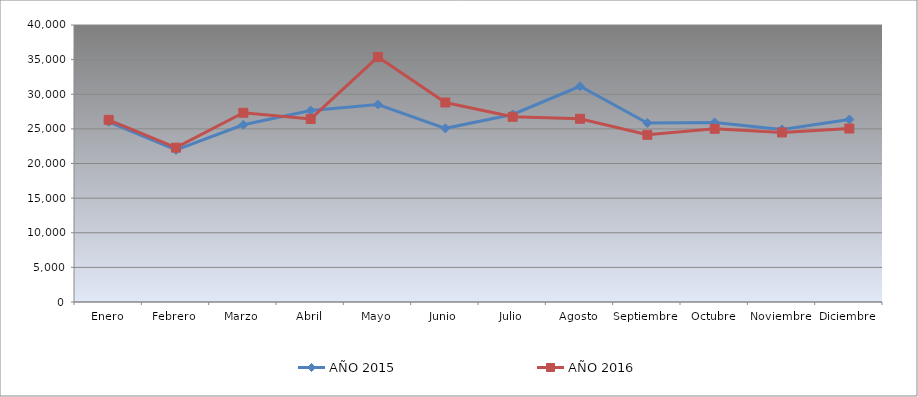
| Category | AÑO 2015 | AÑO 2016 |
|---|---|---|
| Enero | 26028.725 | 26305.441 |
| Febrero | 21951.359 | 22287.591 |
| Marzo | 25592.734 | 27328.765 |
| Abril | 27659.021 | 26435.464 |
| Mayo | 28514.765 | 35392.557 |
| Junio | 25077.989 | 28811.18 |
| Julio | 27080.136 | 26747.678 |
| Agosto | 31153.442 | 26457.937 |
| Septiembre | 25855.79 | 24144.021 |
| Octubre | 25924.802 | 25009.231 |
| Noviembre | 24921.292 | 24483.524 |
| Diciembre | 26350.237 | 25050.164 |